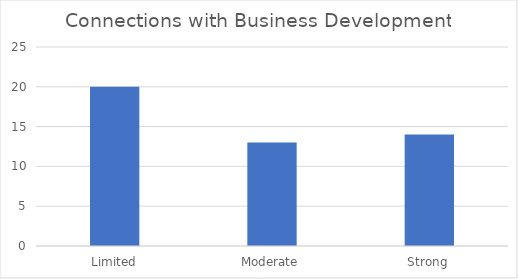
| Category | Connections with Business Development |
|---|---|
| Limited | 20 |
| Moderate | 13 |
| Strong | 14 |